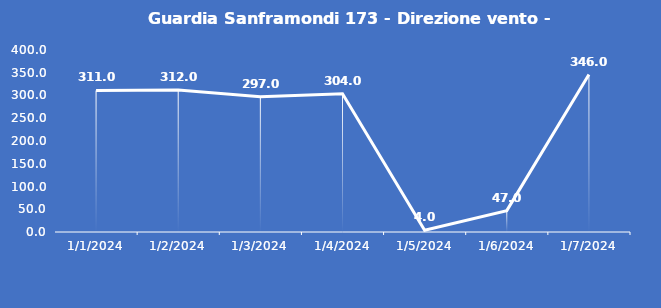
| Category | Guardia Sanframondi 173 - Direzione vento - Grezzo (°N) |
|---|---|
| 1/1/24 | 311 |
| 1/2/24 | 312 |
| 1/3/24 | 297 |
| 1/4/24 | 304 |
| 1/5/24 | 4 |
| 1/6/24 | 47 |
| 1/7/24 | 346 |